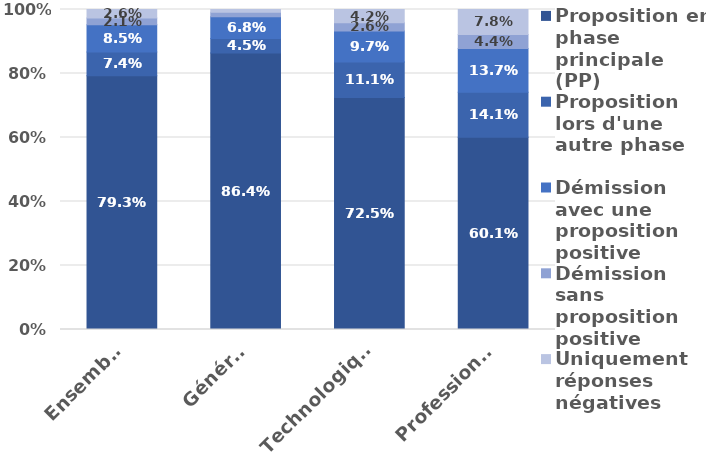
| Category | Proposition en phase principale (PP) | Proposition lors d'une autre phase | Démission avec une proposition positive | Démission sans proposition positive | Uniquement réponses négatives |
|---|---|---|---|---|---|
| Ensemble | 0.793 | 0.074 | 0.085 | 0.021 | 0.026 |
| Général | 0.864 | 0.045 | 0.068 | 0.014 | 0.008 |
| Technologique | 0.725 | 0.111 | 0.097 | 0.026 | 0.042 |
| Professionnel | 0.601 | 0.141 | 0.137 | 0.044 | 0.078 |